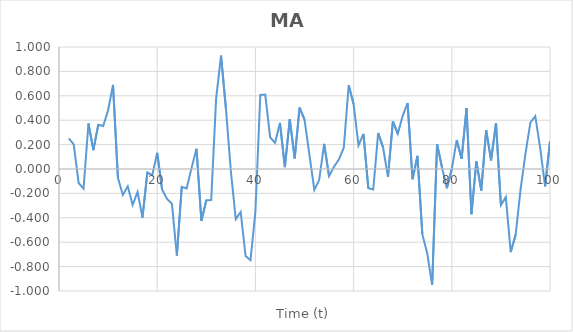
| Category | Series 0 |
|---|---|
| 2.0 | 0.25 |
| 3.0 | 0.202 |
| 4.0 | -0.115 |
| 5.0 | -0.161 |
| 6.0 | 0.373 |
| 7.0 | 0.155 |
| 8.0 | 0.363 |
| 9.0 | 0.353 |
| 10.0 | 0.482 |
| 11.0 | 0.689 |
| 12.0 | -0.072 |
| 13.0 | -0.213 |
| 14.0 | -0.142 |
| 15.0 | -0.294 |
| 16.0 | -0.188 |
| 17.0 | -0.398 |
| 18.0 | -0.028 |
| 19.0 | -0.05 |
| 20.0 | 0.133 |
| 21.0 | -0.169 |
| 22.0 | -0.246 |
| 23.0 | -0.285 |
| 24.0 | -0.709 |
| 25.0 | -0.146 |
| 26.0 | -0.16 |
| 27.0 | 0.009 |
| 28.0 | 0.166 |
| 29.0 | -0.425 |
| 30.0 | -0.257 |
| 31.0 | -0.255 |
| 32.0 | 0.578 |
| 33.0 | 0.929 |
| 34.0 | 0.492 |
| 35.0 | -0.017 |
| 36.0 | -0.411 |
| 37.0 | -0.352 |
| 38.0 | -0.713 |
| 39.0 | -0.748 |
| 40.0 | -0.352 |
| 41.0 | 0.607 |
| 42.0 | 0.61 |
| 43.0 | 0.261 |
| 44.0 | 0.215 |
| 45.0 | 0.378 |
| 46.0 | 0.015 |
| 47.0 | 0.407 |
| 48.0 | 0.086 |
| 49.0 | 0.503 |
| 50.0 | 0.406 |
| 51.0 | 0.118 |
| 52.0 | -0.171 |
| 53.0 | -0.089 |
| 54.0 | 0.206 |
| 55.0 | -0.059 |
| 56.0 | 0.018 |
| 57.0 | 0.077 |
| 58.0 | 0.174 |
| 59.0 | 0.687 |
| 60.0 | 0.532 |
| 61.0 | 0.194 |
| 62.0 | 0.287 |
| 63.0 | -0.158 |
| 64.0 | -0.169 |
| 65.0 | 0.294 |
| 66.0 | 0.177 |
| 67.0 | -0.065 |
| 68.0 | 0.391 |
| 69.0 | 0.289 |
| 70.0 | 0.436 |
| 71.0 | 0.54 |
| 72.0 | -0.084 |
| 73.0 | 0.108 |
| 74.0 | -0.534 |
| 75.0 | -0.693 |
| 76.0 | -0.949 |
| 77.0 | 0.205 |
| 78.0 | 0.013 |
| 79.0 | -0.157 |
| 80.0 | 0.001 |
| 81.0 | 0.237 |
| 82.0 | 0.084 |
| 83.0 | 0.5 |
| 84.0 | -0.37 |
| 85.0 | 0.063 |
| 86.0 | -0.177 |
| 87.0 | 0.318 |
| 88.0 | 0.071 |
| 89.0 | 0.376 |
| 90.0 | -0.296 |
| 91.0 | -0.231 |
| 92.0 | -0.681 |
| 93.0 | -0.539 |
| 94.0 | -0.169 |
| 95.0 | 0.123 |
| 96.0 | 0.38 |
| 97.0 | 0.433 |
| 98.0 | 0.173 |
| 99.0 | -0.142 |
| 100.0 | 0.226 |